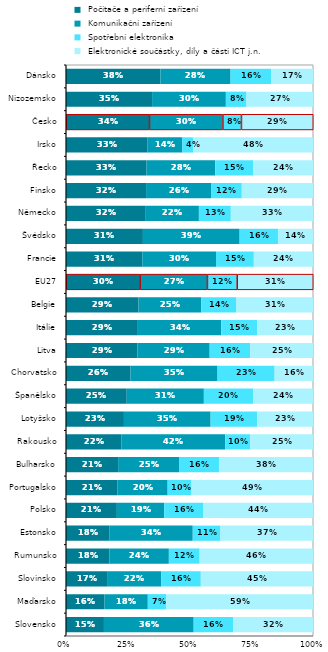
| Category |  Počítače a periferní zařízení |  Komunikační zařízení |  Spotřební elektronika |  Elektronické součástky, díly a části ICT j.n. |
|---|---|---|---|---|
| Slovensko | 0.154 | 0.363 | 0.16 | 0.323 |
| Maďarsko | 0.156 | 0.175 | 0.075 | 0.594 |
| Slovinsko | 0.166 | 0.219 | 0.16 | 0.454 |
| Rumunsko | 0.176 | 0.24 | 0.125 | 0.459 |
| Estonsko | 0.177 | 0.336 | 0.112 | 0.375 |
| Polsko | 0.206 | 0.192 | 0.159 | 0.443 |
| Portugalsko | 0.209 | 0.203 | 0.097 | 0.492 |
| Bulharsko | 0.211 | 0.248 | 0.161 | 0.38 |
| Rakousko | 0.225 | 0.42 | 0.102 | 0.253 |
| Lotyšsko | 0.235 | 0.351 | 0.189 | 0.226 |
| Španělsko | 0.246 | 0.312 | 0.199 | 0.243 |
| Chorvatsko | 0.261 | 0.352 | 0.231 | 0.155 |
| Litva | 0.289 | 0.292 | 0.164 | 0.254 |
| Itálie | 0.291 | 0.338 | 0.145 | 0.226 |
| Belgie | 0.293 | 0.254 | 0.142 | 0.31 |
| EU27 | 0.299 | 0.272 | 0.121 | 0.308 |
| Francie | 0.309 | 0.298 | 0.153 | 0.24 |
| Švédsko | 0.311 | 0.392 | 0.155 | 0.142 |
| Německo | 0.323 | 0.215 | 0.129 | 0.333 |
| Finsko | 0.324 | 0.263 | 0.124 | 0.288 |
| Řecko | 0.326 | 0.278 | 0.154 | 0.241 |
| Irsko | 0.33 | 0.14 | 0.045 | 0.484 |
| Česko | 0.337 | 0.297 | 0.075 | 0.291 |
| Nizozemsko | 0.349 | 0.299 | 0.084 | 0.269 |
| Dánsko | 0.382 | 0.284 | 0.165 | 0.169 |